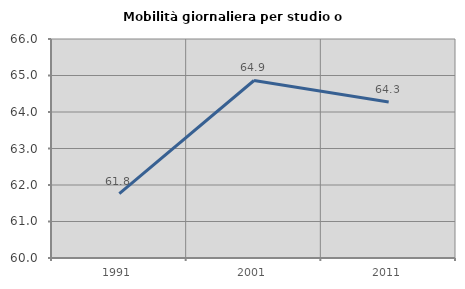
| Category | Mobilità giornaliera per studio o lavoro |
|---|---|
| 1991.0 | 61.763 |
| 2001.0 | 64.863 |
| 2011.0 | 64.276 |